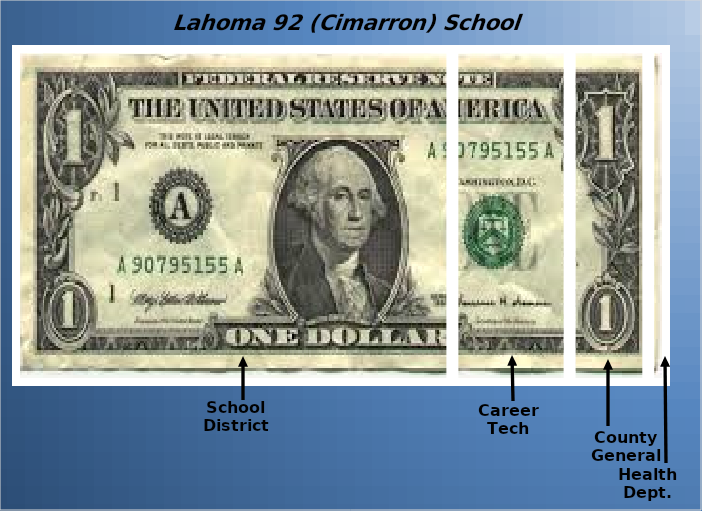
| Category | School District | Career Tech | County General | Health Dept. |
|---|---|---|---|---|
| 0 | 0.67 | 0.179 | 0.12 | 0.03 |